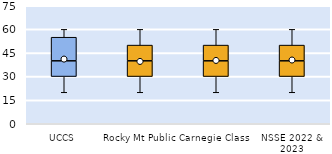
| Category | 25th | 50th | 75th |
|---|---|---|---|
| UCCS | 30 | 10 | 15 |
| Rocky Mt Public | 30 | 10 | 10 |
| Carnegie Class | 30 | 10 | 10 |
| NSSE 2022 & 2023 | 30 | 10 | 10 |